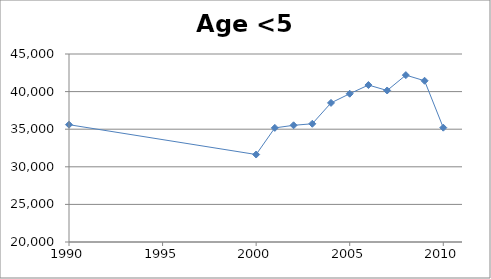
| Category | Series 0 |
|---|---|
| 1990.0 | 35599 |
| 2000.0 | 31633 |
| 2001.0 | 35176 |
| 2002.0 | 35519 |
| 2003.0 | 35722 |
| 2004.0 | 38498 |
| 2005.0 | 39718 |
| 2006.0 | 40872 |
| 2007.0 | 40147 |
| 2008.0 | 42192 |
| 2009.0 | 41441 |
| 2010.0 | 35203 |